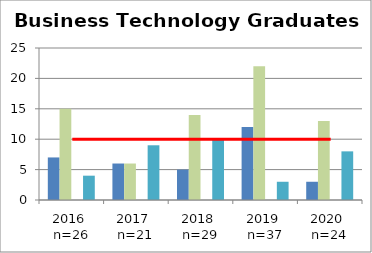
| Category | AC | BA | CS | NAC |
|---|---|---|---|---|
| 2016  n=26 | 7 | 15 | 0 | 4 |
| 2017  n=21 | 6 | 6 | 0 | 9 |
| 2018  n=29 | 5 | 14 | 0 | 10 |
| 2019  n=37 | 12 | 22 | 0 | 3 |
| 2020  n=24 | 3 | 13 | 0 | 8 |